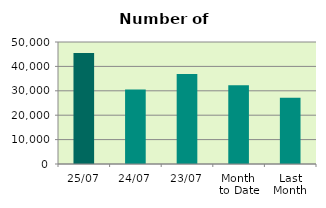
| Category | Series 0 |
|---|---|
| 25/07 | 45522 |
| 24/07 | 30526 |
| 23/07 | 36836 |
| Month 
to Date | 32265.474 |
| Last
Month | 27125.1 |